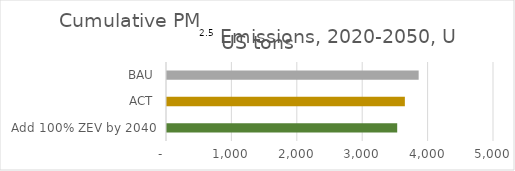
| Category | Cumulative PM2.5 Emissions, 2020-2050, US tons |
|---|---|
| Add 100% ZEV by 2040 | 3519.885 |
| ACT | 3637 |
| BAU | 3848 |